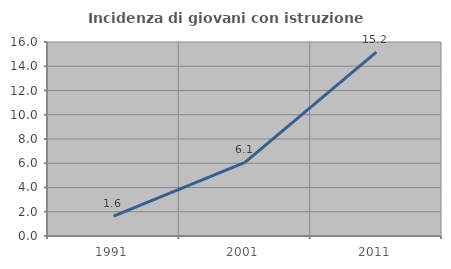
| Category | Incidenza di giovani con istruzione universitaria |
|---|---|
| 1991.0 | 1.639 |
| 2001.0 | 6.079 |
| 2011.0 | 15.17 |